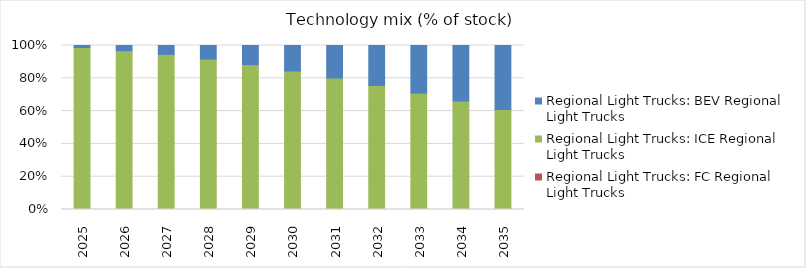
| Category | Regional Light Trucks: FC Regional Light Trucks | Regional Light Trucks: ICE Regional Light Trucks | Regional Light Trucks: BEV Regional Light Trucks |
|---|---|---|---|
| 2025.0 | 0 | 0.988 | 0.012 |
| 2026.0 | 0 | 0.968 | 0.032 |
| 2027.0 | 0 | 0.946 | 0.054 |
| 2028.0 | 0 | 0.917 | 0.083 |
| 2029.0 | 0 | 0.883 | 0.117 |
| 2030.0 | 0 | 0.844 | 0.156 |
| 2031.0 | 0 | 0.802 | 0.198 |
| 2032.0 | 0 | 0.757 | 0.243 |
| 2033.0 | 0 | 0.71 | 0.29 |
| 2034.0 | 0 | 0.661 | 0.339 |
| 2035.0 | 0 | 0.611 | 0.389 |